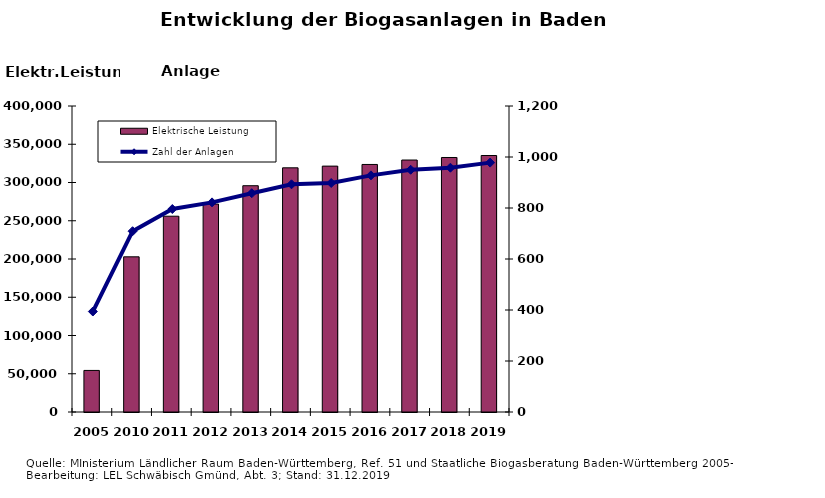
| Category | Elektrische Leistung |
|---|---|
| 2005.0 | 54347 |
| 2010.0 | 202848 |
| 2011.0 | 255928 |
| 2012.0 | 271812 |
| 2013.0 | 295798 |
| 2014.0 | 319181 |
| 2015.0 | 321408 |
| 2016.0 | 323578 |
| 2017.0 | 329382 |
| 2018.0 | 332692 |
| 2019.0 | 335281 |